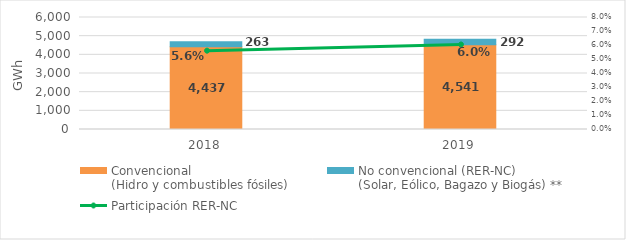
| Category | Convencional
(Hidro y combustibles fósiles) | No convencional (RER-NC)
(Solar, Eólico, Bagazo y Biogás) ** |
|---|---|---|
| 2018.0 | 4436.763 | 262.917 |
| 2019.0 | 4540.736 | 291.747 |